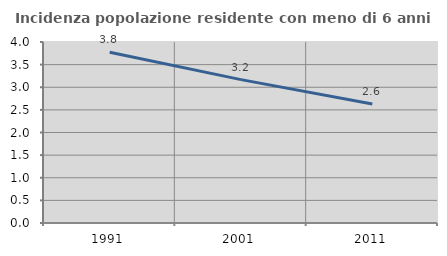
| Category | Incidenza popolazione residente con meno di 6 anni |
|---|---|
| 1991.0 | 3.774 |
| 2001.0 | 3.169 |
| 2011.0 | 2.632 |